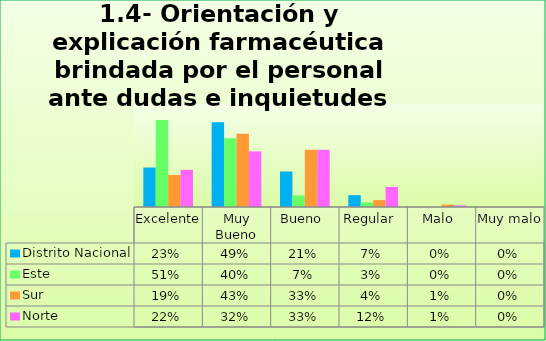
| Category | Distrito Nacional | Este | Sur  | Norte |
|---|---|---|---|---|
| Excelente | 0.23 | 0.507 | 0.187 | 0.216 |
| Muy Bueno | 0.494 | 0.4 | 0.427 | 0.324 |
| Bueno  | 0.207 | 0.067 | 0.333 | 0.333 |
| Regular  | 0.069 | 0.027 | 0.04 | 0.117 |
| Malo  | 0 | 0 | 0.013 | 0.009 |
| Muy malo  | 0 | 0 | 0 | 0 |